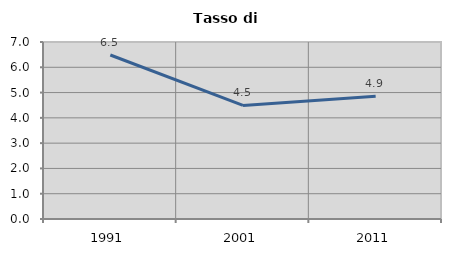
| Category | Tasso di disoccupazione   |
|---|---|
| 1991.0 | 6.486 |
| 2001.0 | 4.49 |
| 2011.0 | 4.857 |